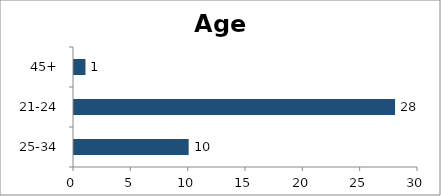
| Category | Age |
|---|---|
| 25-34 | 10 |
| 21-24 | 28 |
| 45+ | 1 |